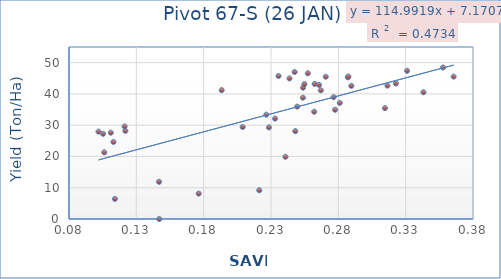
| Category | Series 0 |
|---|---|
| 0.253825 | 42 |
| 0.267021 | 41.17 |
| 0.287099 | 45.3 |
| 0.221283 | 9.2 |
| 0.114091 | 6.43 |
| 0.262473 | 43.2 |
| 0.28965 | 42.57 |
| 0.248036 | 28.1 |
| 0.357733 | 48.45 |
| 0.314645 | 35.45 |
| 0.11104 | 27.6 |
| 0.10193 | 27.95 |
| 0.12186 | 28.18 |
| 0.247564 | 47.01 |
| 0.276495 | 38.97 |
| 0.365631 | 45.55 |
| 0.331041 | 47.39 |
| 0.343208 | 40.53 |
| 0.265652 | 42.88 |
| 0.226531 | 33.37 |
| 0.10618 | 21.32 |
| 0.22847 | 29.32 |
| 0.262075 | 34.3 |
| 0.31643 | 42.66 |
| 0.28106 | 37.14 |
| 0.270673 | 45.5 |
| 0.235576 | 45.73 |
| 0.113044 | 24.63 |
| 0.249441 | 35.94 |
| 0.146987 | 0 |
| 0.243723 | 44.95 |
| 0.254829 | 43.14 |
| 0.277574 | 34.92 |
| 0.240735 | 19.89 |
| 0.257384 | 46.62 |
| 0.253712 | 38.79 |
| 0.287475 | 45.58 |
| 0.233029 | 32.13 |
| 0.105289 | 27.24 |
| 0.14687 | 11.89 |
| 0.19338 | 41.2 |
| 0.121286 | 29.61 |
| 0.322737 | 43.35 |
| 0.208972 | 29.42 |
| 0.176299 | 8.13 |